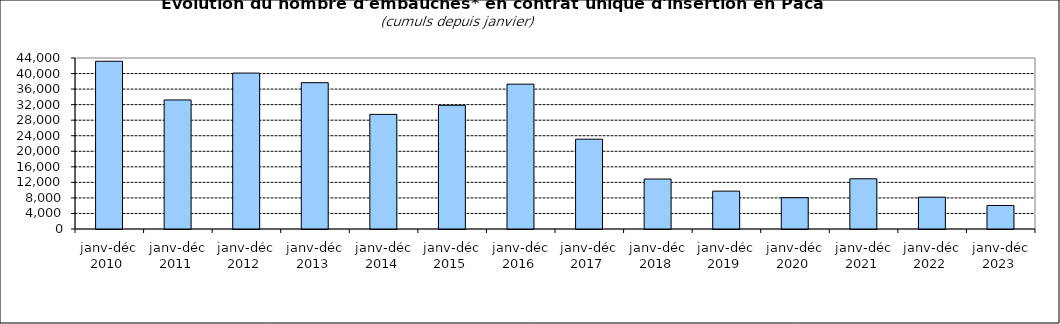
| Category | Series 1 |
|---|---|
| janv-déc 2010  | 43158 |
| janv-déc 2011  | 33209 |
| janv-déc 2012  | 40119 |
| janv-déc 2013  | 37649 |
| janv-déc 2014  | 29494 |
| janv-déc 2015  | 31833 |
| janv-déc 2016  | 37268 |
| janv-déc 2017  | 23112 |
| janv-déc 2018  | 12857 |
| janv-déc 2019  | 9745 |
| janv-déc 2020  | 8050 |
| janv-déc 2021  | 12923 |
| janv-déc 2022  | 8188 |
| janv-déc 2023  | 6047 |